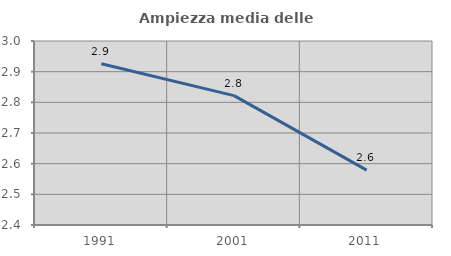
| Category | Ampiezza media delle famiglie |
|---|---|
| 1991.0 | 2.926 |
| 2001.0 | 2.822 |
| 2011.0 | 2.579 |